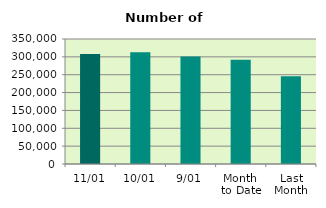
| Category | Series 0 |
|---|---|
| 11/01 | 307952 |
| 10/01 | 313102 |
| 9/01 | 301226 |
| Month 
to Date | 291983.75 |
| Last
Month | 245553.619 |